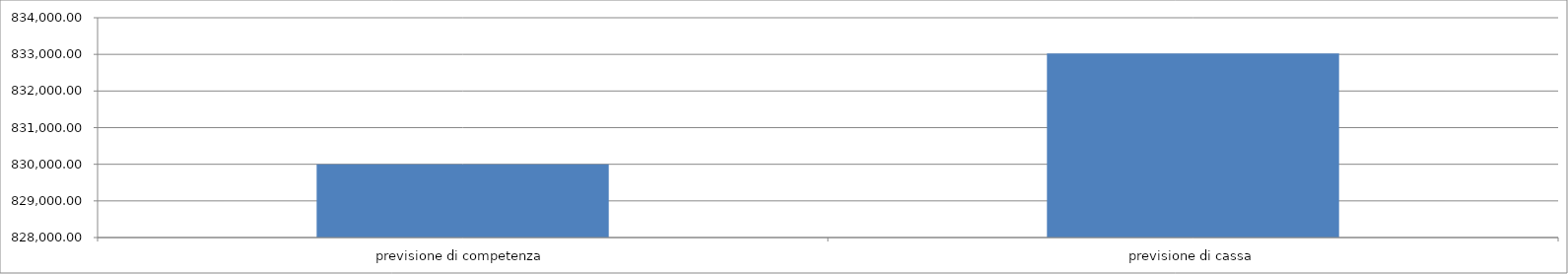
| Category | Series 0 |
|---|---|
| previsione di competenza | 830000 |
| previsione di cassa | 833026.52 |